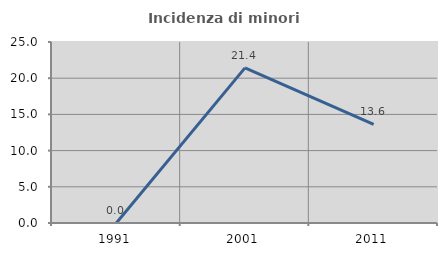
| Category | Incidenza di minori stranieri |
|---|---|
| 1991.0 | 0 |
| 2001.0 | 21.429 |
| 2011.0 | 13.636 |